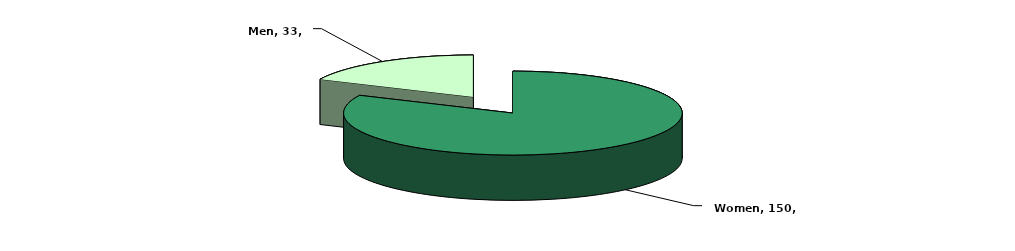
| Category | Series 0 |
|---|---|
| Women | 150 |
| Men | 33 |